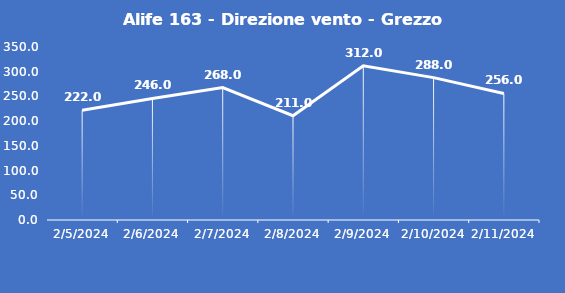
| Category | Alife 163 - Direzione vento - Grezzo (°N) |
|---|---|
| 2/5/24 | 222 |
| 2/6/24 | 246 |
| 2/7/24 | 268 |
| 2/8/24 | 211 |
| 2/9/24 | 312 |
| 2/10/24 | 288 |
| 2/11/24 | 256 |